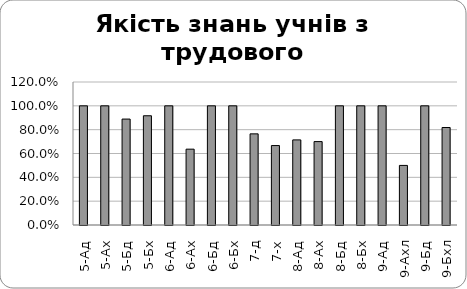
| Category | Series 0 |
|---|---|
| 5-Ад | 1 |
| 5-Ах | 1 |
| 5-Бд | 0.889 |
| 5-Бх | 0.917 |
| 6-Ад | 1 |
| 6-Ах | 0.636 |
| 6-Бд | 1 |
| 6-Бх | 1 |
| 7-д | 0.765 |
| 7-х | 0.667 |
| 8-Ад | 0.714 |
| 8-Ах | 0.7 |
| 8-Бд | 1 |
| 8-Бх | 1 |
| 9-Ад | 1 |
| 9-Ахл | 0.5 |
| 9-Бд | 1 |
| 9-Бхл | 0.818 |